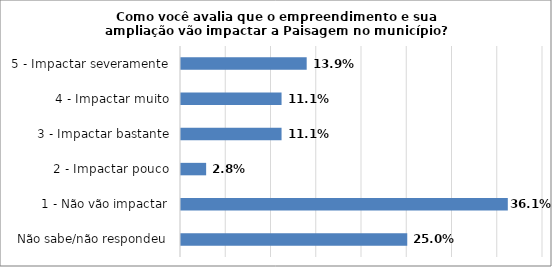
| Category | Series 0 |
|---|---|
| Não sabe/não respondeu | 0.25 |
| 1 - Não vão impactar | 0.361 |
| 2 - Impactar pouco | 0.028 |
| 3 - Impactar bastante | 0.111 |
| 4 - Impactar muito | 0.111 |
| 5 - Impactar severamente | 0.139 |